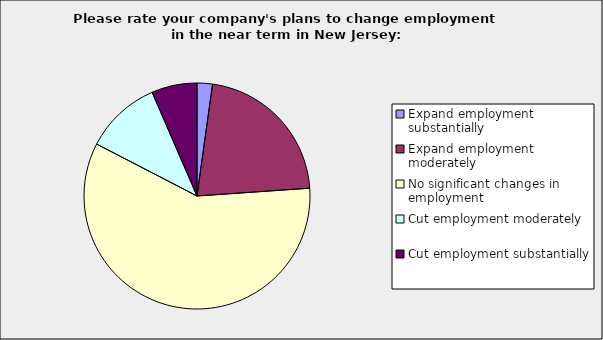
| Category | Series 0 |
|---|---|
| Expand employment substantially | 0.022 |
| Expand employment moderately | 0.217 |
| No significant changes in employment | 0.587 |
| Cut employment moderately | 0.109 |
| Cut employment substantially | 0.065 |